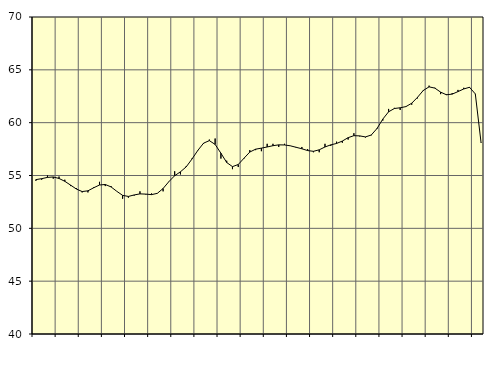
| Category | Piggar | Samtliga fast anställda (inkl. fast anställda utomlands) |
|---|---|---|
| nan | 54.5 | 54.61 |
| 1.0 | 54.6 | 54.7 |
| 1.0 | 55 | 54.82 |
| 1.0 | 54.7 | 54.86 |
| nan | 54.9 | 54.72 |
| 2.0 | 54.6 | 54.45 |
| 2.0 | 54 | 54.09 |
| 2.0 | 53.8 | 53.72 |
| nan | 53.4 | 53.48 |
| 3.0 | 53.4 | 53.55 |
| 3.0 | 53.9 | 53.84 |
| 3.0 | 54.4 | 54.1 |
| nan | 54 | 54.15 |
| 4.0 | 54 | 53.92 |
| 4.0 | 53.5 | 53.5 |
| 4.0 | 52.8 | 53.12 |
| nan | 52.9 | 53.02 |
| 5.0 | 53.1 | 53.16 |
| 5.0 | 53.5 | 53.26 |
| 5.0 | 53.2 | 53.24 |
| nan | 53.3 | 53.19 |
| 6.0 | 53.3 | 53.31 |
| 6.0 | 53.5 | 53.77 |
| 6.0 | 54.4 | 54.42 |
| nan | 55.4 | 54.98 |
| 7.0 | 55.1 | 55.35 |
| 7.0 | 55.9 | 55.82 |
| 7.0 | 56.6 | 56.56 |
| nan | 57.4 | 57.37 |
| 8.0 | 58 | 58.06 |
| 8.0 | 58.4 | 58.3 |
| 8.0 | 58.5 | 57.94 |
| nan | 56.6 | 57.11 |
| 9.0 | 56.4 | 56.23 |
| 9.0 | 55.6 | 55.84 |
| 9.0 | 55.8 | 56.04 |
| nan | 56.6 | 56.64 |
| 10.0 | 57.4 | 57.22 |
| 10.0 | 57.4 | 57.49 |
| 10.0 | 57.3 | 57.59 |
| nan | 58 | 57.7 |
| 11.0 | 58 | 57.82 |
| 11.0 | 57.7 | 57.9 |
| 11.0 | 58 | 57.89 |
| nan | 57.8 | 57.81 |
| 12.0 | 57.7 | 57.67 |
| 12.0 | 57.7 | 57.53 |
| 12.0 | 57.5 | 57.36 |
| nan | 57.2 | 57.29 |
| 13.0 | 57.2 | 57.43 |
| 13.0 | 58 | 57.7 |
| 13.0 | 57.8 | 57.9 |
| nan | 58.2 | 58.03 |
| 14.0 | 58.1 | 58.26 |
| 14.0 | 58.4 | 58.58 |
| 14.0 | 59 | 58.77 |
| nan | 58.7 | 58.75 |
| 15.0 | 58.6 | 58.65 |
| 15.0 | 58.8 | 58.83 |
| 15.0 | 59.4 | 59.45 |
| nan | 60.2 | 60.34 |
| 16.0 | 61.3 | 61.03 |
| 16.0 | 61.4 | 61.34 |
| 16.0 | 61.2 | 61.41 |
| nan | 61.5 | 61.52 |
| 17.0 | 61.7 | 61.84 |
| 17.0 | 62.3 | 62.4 |
| 17.0 | 63 | 63.05 |
| nan | 63.5 | 63.39 |
| 18.0 | 63.3 | 63.27 |
| 18.0 | 62.7 | 62.89 |
| 18.0 | 62.7 | 62.64 |
| nan | 62.8 | 62.7 |
| 19.0 | 63.1 | 62.94 |
| 19.0 | 63.3 | 63.19 |
| 19.0 | 63.3 | 63.35 |
| nan | 62.7 | 62.72 |
| 20.0 | 58.1 | 58.08 |